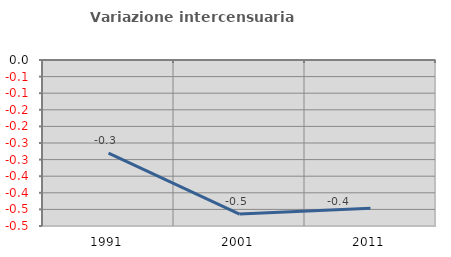
| Category | Variazione intercensuaria annua |
|---|---|
| 1991.0 | -0.281 |
| 2001.0 | -0.464 |
| 2011.0 | -0.446 |